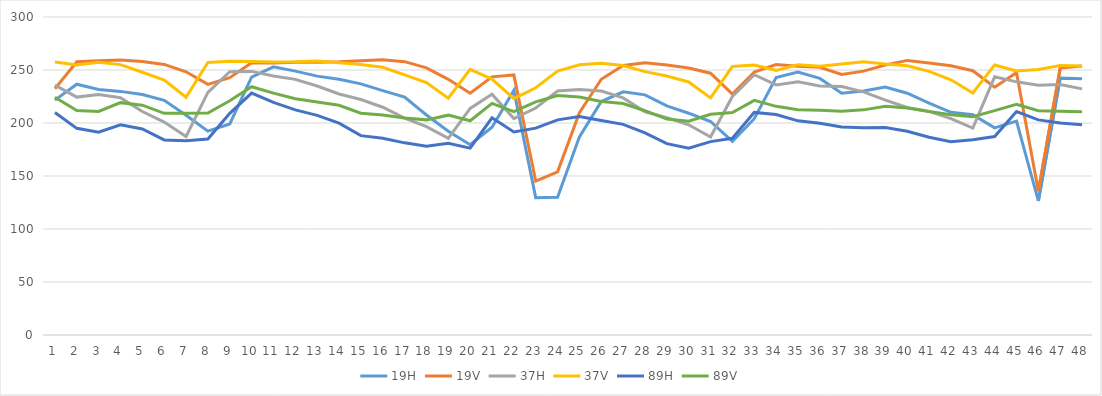
| Category | 19H | 19V | 37H | 37V | 89H | 89V |
|---|---|---|---|---|---|---|
| 0 | 221.564 | 232.334 | 235.79 | 257.582 | 209.945 | 224.295 |
| 1 | 236.59 | 257.782 | 224.425 | 254.721 | 194.953 | 211.763 |
| 2 | 231.647 | 258.673 | 226.941 | 257.382 | 191.242 | 210.889 |
| 3 | 229.827 | 259.497 | 223.864 | 255.069 | 198.213 | 219.195 |
| 4 | 226.905 | 257.969 | 210.793 | 247.881 | 194.418 | 216.793 |
| 5 | 221.418 | 255.258 | 200.898 | 240.547 | 184.043 | 209.098 |
| 6 | 207.378 | 248.294 | 187.262 | 224.331 | 183.245 | 209.173 |
| 7 | 192.33 | 236.431 | 228.892 | 257.146 | 184.92 | 209.466 |
| 8 | 199.147 | 242.793 | 248.441 | 258.158 | 209.102 | 220.925 |
| 9 | 243.344 | 256.82 | 248.68 | 258.014 | 228.221 | 234.243 |
| 10 | 253.026 | 256.519 | 244.262 | 257.551 | 219.375 | 228.178 |
| 11 | 248.926 | 257.287 | 241.147 | 257.686 | 212.404 | 222.858 |
| 12 | 244.227 | 257.422 | 234.879 | 258.492 | 207.24 | 219.76 |
| 13 | 241.188 | 257.867 | 227.359 | 256.731 | 199.897 | 216.732 |
| 14 | 236.935 | 258.808 | 222.175 | 255.242 | 188.067 | 209.257 |
| 15 | 230.57 | 259.557 | 214.871 | 252.614 | 185.695 | 207.531 |
| 16 | 224.457 | 257.875 | 204.694 | 245.327 | 181.272 | 204.647 |
| 17 | 207.562 | 251.992 | 196.601 | 238.083 | 178.086 | 202.958 |
| 18 | 192.283 | 241.192 | 185.53 | 223.336 | 180.849 | 207.391 |
| 19 | 179.528 | 228.064 | 213.781 | 250.697 | 176.306 | 202.131 |
| 20 | 196.01 | 243.552 | 227.166 | 241.471 | 204.888 | 218.49 |
| 21 | 230.79 | 245.394 | 204.138 | 222.969 | 191.494 | 210.632 |
| 22 | 129.586 | 145.163 | 214.151 | 233.231 | 195.126 | 219.971 |
| 23 | 129.916 | 153.987 | 230.161 | 248.888 | 202.973 | 225.979 |
| 24 | 186.938 | 209.672 | 231.593 | 254.983 | 206.089 | 224.542 |
| 25 | 220.264 | 241.236 | 230.218 | 256.253 | 202.401 | 220.238 |
| 26 | 229.41 | 254.234 | 223.646 | 254.179 | 198.694 | 218.406 |
| 27 | 226.543 | 256.944 | 210.573 | 248.482 | 190.689 | 211.593 |
| 28 | 216.098 | 254.796 | 205.071 | 244.352 | 180.51 | 203.709 |
| 29 | 209.227 | 251.87 | 198.29 | 238.718 | 176.278 | 201.679 |
| 30 | 201.403 | 246.948 | 186.803 | 223.691 | 182.448 | 208.249 |
| 31 | 182.606 | 227.207 | 225.018 | 253.365 | 185.589 | 209.856 |
| 32 | 204.074 | 247.954 | 245.573 | 254.717 | 209.997 | 221.322 |
| 33 | 242.986 | 255.158 | 235.918 | 249.687 | 207.922 | 215.717 |
| 34 | 247.985 | 253.549 | 238.966 | 255.03 | 202.036 | 212.606 |
| 35 | 242.078 | 252.506 | 234.917 | 253.538 | 199.764 | 212.123 |
| 36 | 228.168 | 245.795 | 234.485 | 255.705 | 196.219 | 211.006 |
| 37 | 230.285 | 248.927 | 229.334 | 257.816 | 195.443 | 212.394 |
| 38 | 233.962 | 254.674 | 221.574 | 255.623 | 195.639 | 215.776 |
| 39 | 228.089 | 259.06 | 214.63 | 253.953 | 192.258 | 214.075 |
| 40 | 218.728 | 256.677 | 210.922 | 248.665 | 186.584 | 210.8 |
| 41 | 210.123 | 253.933 | 204.162 | 240.812 | 182.401 | 207.71 |
| 42 | 207.712 | 249.298 | 195.255 | 228.317 | 184.127 | 205.907 |
| 43 | 195.411 | 233.792 | 243.567 | 254.762 | 187.162 | 211.684 |
| 44 | 201.717 | 247.516 | 238.822 | 249.163 | 210.736 | 217.569 |
| 45 | 126.463 | 135.655 | 235.694 | 250.572 | 202.943 | 211.512 |
| 46 | 242.47 | 251.771 | 236.26 | 254.166 | 200.039 | 211.122 |
| 47 | 241.705 | 253.795 | 232.2 | 253.825 | 198.255 | 210.505 |